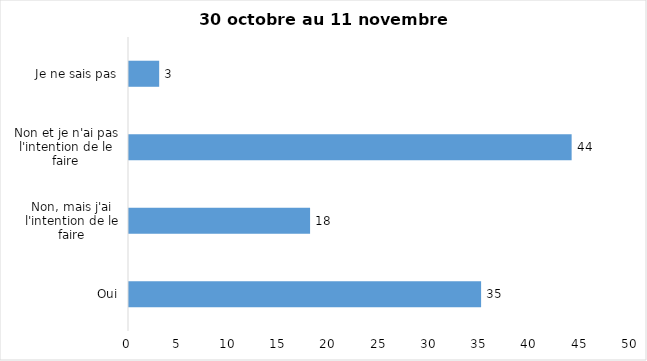
| Category | Series 0 |
|---|---|
| Oui | 35 |
| Non, mais j'ai l'intention de le faire | 18 |
| Non et je n'ai pas l'intention de le faire | 44 |
| Je ne sais pas | 3 |